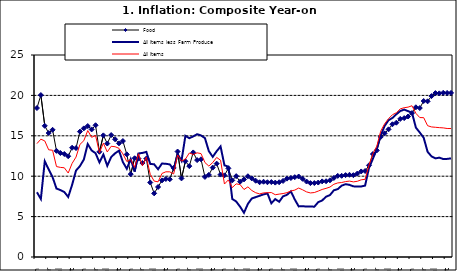
| Category | Food | All Items less Farm Produce | All Items |
|---|---|---|---|
| 09-Jan | 18.436 | 8.013 | 14.034 |
| Feb | 20.041 | 7.178 | 14.584 |
| Mar | 16.233 | 11.842 | 14.366 |
| Apr | 15.342 | 10.85 | 13.268 |
| May | 15.74 | 9.88 | 13.212 |
| June | 13.138 | 8.472 | 11.194 |
| Jul | 12.867 | 8.285 | 11.09 |
| Aug | 12.746 | 8.044 | 11.046 |
| Sep | 12.472 | 7.431 | 10.39 |
| Oct | 13.524 | 8.933 | 11.588 |
| Nov | 13.482 | 10.702 | 12.368 |
| Dec | 15.518 | 11.249 | 13.93 |
| 10-Jan | 15.918 | 12.063 | 14.398 |
| Feb | 16.208 | 13.978 | 15.649 |
| Mar | 15.79 | 13.184 | 14.812 |
| Apr | 16.306 | 12.844 | 15.044 |
| May | 13.023 | 11.711 | 12.915 |
| Jun | 15.053 | 12.686 | 14.099 |
| Jul | 14.043 | 11.287 | 13.002 |
| Aug | 15.09 | 12.366 | 13.702 |
| Sep | 14.57 | 12.83 | 13.65 |
| Oct | 14.065 | 13.168 | 13.45 |
| Nov | 14.351 | 11.746 | 12.766 |
| Dec | 12.701 | 10.917 | 11.815 |
| 11-Jan | 10.255 | 12.118 | 12.08 |
| Feb | 12.221 | 10.569 | 11.1 |
| Mar | 12.169 | 12.815 | 12.779 |
| Apr | 11.629 | 12.882 | 11.291 |
| May | 12.179 | 13.006 | 12.352 |
| Jun | 9.22 | 11.524 | 10.23 |
| Jul | 7.877 | 11.472 | 9.397 |
| Aug | 8.665 | 10.863 | 9.301 |
| Sep | 9.479 | 11.567 | 10.339 |
| Oct | 9.656 | 11.539 | 10.544 |
| Nov | 9.623 | 11.459 | 10.54 |
| Dec | 11.02 | 10.822 | 10.283 |
| 12-Jan | 13.053 | 12.748 | 12.626 |
| 12-Feb | 9.729 | 11.901 | 11.866 |
| 12-Mar | 11.848 | 14.995 | 12.111 |
| Apr | 11.246 | 14.703 | 12.866 |
| May | 12.942 | 14.926 | 12.688 |
| Jun | 11.991 | 15.199 | 12.892 |
| Jul | 12.093 | 15.045 | 12.797 |
| Aug | 9.91 | 14.714 | 11.689 |
| Sep | 10.164 | 13.101 | 11.253 |
| Oct | 11.064 | 12.398 | 11.693 |
| Nov | 11.553 | 13.092 | 12.32 |
| Dec | 10.199 | 13.685 | 11.981 |
| 13-Jan | 10.106 | 11.342 | 9.031 |
| Feb | 10.973 | 11.184 | 9.542 |
| Mar | 9.482 | 7.179 | 8.593 |
| Apr | 10.006 | 6.874 | 9.052 |
| May | 9.321 | 6.227 | 8.964 |
| Jun | 9.606 | 5.472 | 8.353 |
| Jul | 9.994 | 6.58 | 8.682 |
| Aug | 9.723 | 7.245 | 8.231 |
| Sep | 9.437 | 7.41 | 7.952 |
| Oct | 9.249 | 7.579 | 7.807 |
| Nov | 9.313 | 7.75 | 7.931 |
| Dec | 9.253 | 7.872 | 7.957 |
| 14-Jan | 9.271 | 6.648 | 7.977 |
| Feb | 9.207 | 7.166 | 7.707 |
| Mar | 9.254 | 6.836 | 7.783 |
| Apr | 9.414 | 7.508 | 7.851 |
| May | 9.698 | 7.693 | 7.965 |
| Jun | 9.776 | 8.122 | 8.167 |
| Jul | 9.878 | 7.116 | 8.281 |
| Aug | 9.959 | 6.264 | 8.534 |
| Sep | 9.676 | 6.278 | 8.317 |
| Oct | 9.343 | 6.252 | 8.06 |
| Nov | 9.144 | 6.255 | 7.927 |
| Dec | 9.152 | 6.225 | 7.978 |
| 15-Jan | 9.215 | 6.787 | 8.157 |
| Feb | 9.359 | 6.994 | 8.359 |
| Mar | 9.376 | 7.46 | 8.494 |
| Apr | 9.49 | 7.661 | 8.655 |
| May | 9.782 | 8.253 | 9.003 |
| Jun | 10.041 | 8.403 | 9.168 |
| Jul | 10.049 | 8.83 | 9.218 |
| Aug | 10.131 | 9.01 | 9.336 |
| Sep | 10.174 | 8.928 | 9.394 |
| Oct | 10.129 | 8.742 | 9.296 |
| Nov | 10.321 | 8.732 | 9.368 |
| Dec | 10.588 | 8.727 | 9.554 |
| 16-Jan | 10.642 | 8.841 | 9.617 |
| Feb | 11.348 | 11.041 | 11.379 |
| Mar | 12.745 | 12.17 | 12.775 |
| Apr | 13.194 | 13.352 | 13.721 |
| May | 14.861 | 15.054 | 15.577 |
| Jun | 15.302 | 16.224 | 16.48 |
| Jul | 15.799 | 16.929 | 17.127 |
| Aug | 16.427 | 17.208 | 17.609 |
| Sep | 16.622 | 17.666 | 17.852 |
| Oct | 17.09 | 18.067 | 18.33 |
| Nov | 17.191 | 18.241 | 18.476 |
| Dec | 17.388 | 18.052 | 18.547 |
| 17-Jan | 17.818 | 17.867 | 18.719 |
| Feb | 18.528 | 16.011 | 17.78 |
| Mar | 18.436 | 15.404 | 17.256 |
| Apr | 19.303 | 14.75 | 17.244 |
| May | 19.266 | 13.016 | 16.251 |
| Jun | 19.915 | 12.455 | 16.098 |
| Jul | 20.284 | 12.207 | 16.053 |
| Aug | 20.251 | 12.296 | 16.012 |
| Sep | 20.321 | 12.123 | 15.979 |
| Oct | 20.306 | 12.142 | 15.905 |
| Nov | 20.308 | 12.206 | 15.901 |